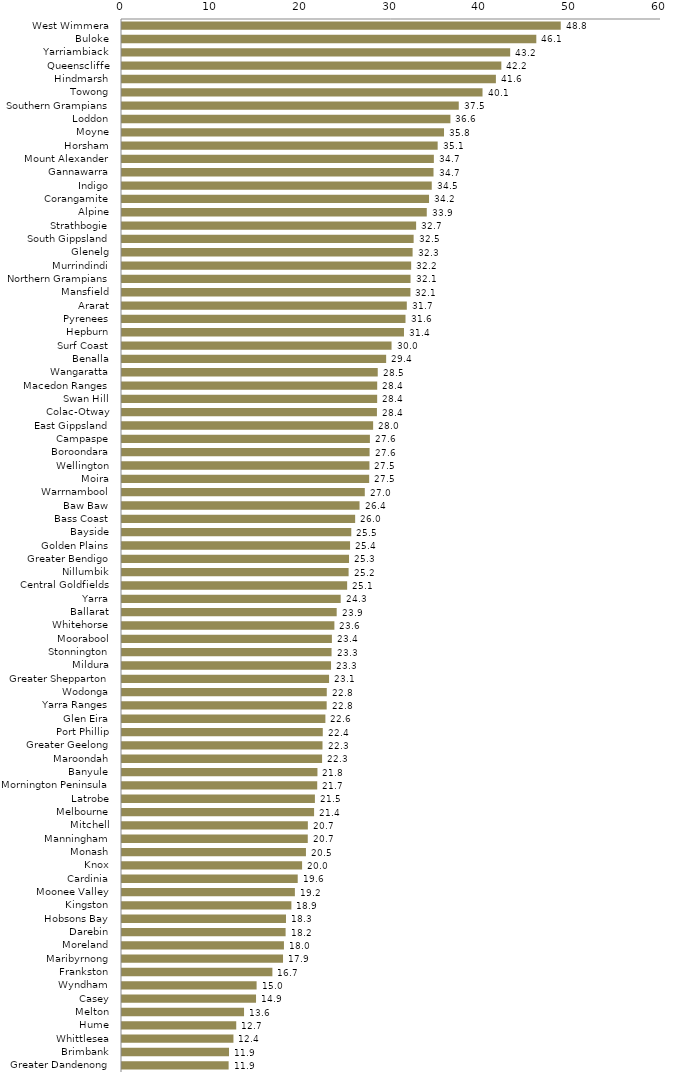
| Category | Series 0 |
|---|---|
| West Wimmera | 48.839 |
| Buloke | 46.12 |
| Yarriambiack | 43.211 |
| Queenscliffe | 42.226 |
| Hindmarsh | 41.621 |
| Towong | 40.133 |
| Southern Grampians | 37.488 |
| Loddon | 36.558 |
| Moyne | 35.846 |
| Horsham | 35.139 |
| Mount Alexander | 34.716 |
| Gannawarra | 34.677 |
| Indigo | 34.481 |
| Corangamite | 34.179 |
| Alpine | 33.926 |
| Strathbogie | 32.741 |
| South Gippsland | 32.464 |
| Glenelg | 32.349 |
| Murrindindi | 32.188 |
| Northern Grampians | 32.119 |
| Mansfield | 32.107 |
| Ararat | 31.703 |
| Pyrenees | 31.558 |
| Hepburn | 31.39 |
| Surf Coast | 30.006 |
| Benalla | 29.404 |
| Wangaratta | 28.468 |
| Macedon Ranges | 28.408 |
| Swan Hill | 28.405 |
| Colac-Otway | 28.379 |
| East Gippsland | 27.955 |
| Campaspe | 27.596 |
| Boroondara | 27.562 |
| Wellington | 27.545 |
| Moira | 27.515 |
| Warrnambool | 27.027 |
| Baw Baw | 26.442 |
| Bass Coast | 25.953 |
| Bayside | 25.522 |
| Golden Plains | 25.387 |
| Greater Bendigo | 25.272 |
| Nillumbik | 25.225 |
| Central Goldfields | 25.063 |
| Yarra | 24.344 |
| Ballarat | 23.899 |
| Whitehorse | 23.643 |
| Moorabool | 23.365 |
| Stonnington | 23.328 |
| Mildura | 23.269 |
| Greater Shepparton | 23.05 |
| Wodonga | 22.794 |
| Yarra Ranges | 22.784 |
| Glen Eira | 22.641 |
| Port Phillip | 22.35 |
| Greater Geelong | 22.32 |
| Maroondah | 22.272 |
| Banyule | 21.757 |
| Mornington Peninsula | 21.732 |
| Latrobe | 21.474 |
| Melbourne | 21.382 |
| Mitchell | 20.689 |
| Manningham | 20.68 |
| Monash | 20.477 |
| Knox | 20.047 |
| Cardinia | 19.561 |
| Moonee Valley | 19.245 |
| Kingston | 18.855 |
| Hobsons Bay | 18.255 |
| Darebin | 18.212 |
| Moreland | 18.028 |
| Maribyrnong | 17.925 |
| Frankston | 16.741 |
| Wyndham | 14.984 |
| Casey | 14.92 |
| Melton | 13.585 |
| Hume | 12.717 |
| Whittlesea | 12.406 |
| Brimbank | 11.913 |
| Greater Dandenong | 11.869 |